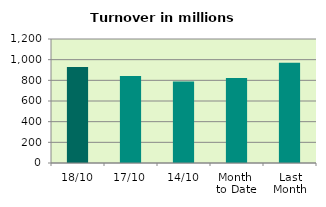
| Category | Series 0 |
|---|---|
| 18/10 | 928.216 |
| 17/10 | 841.91 |
| 14/10 | 788.262 |
| Month 
to Date | 823.526 |
| Last
Month | 970.98 |